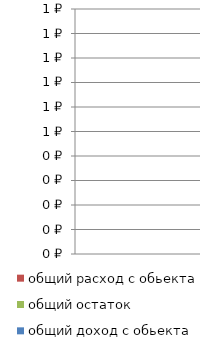
| Category | общий расход с обьекта | общий остаток | общий доход с обьекта |
|---|---|---|---|
| 0 | 0 | 0 | 0 |